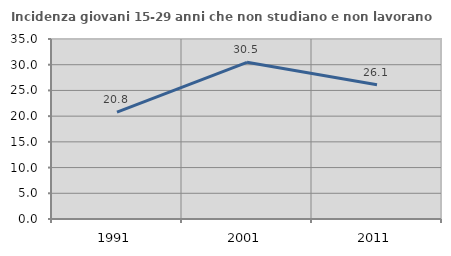
| Category | Incidenza giovani 15-29 anni che non studiano e non lavorano  |
|---|---|
| 1991.0 | 20.783 |
| 2001.0 | 30.468 |
| 2011.0 | 26.111 |